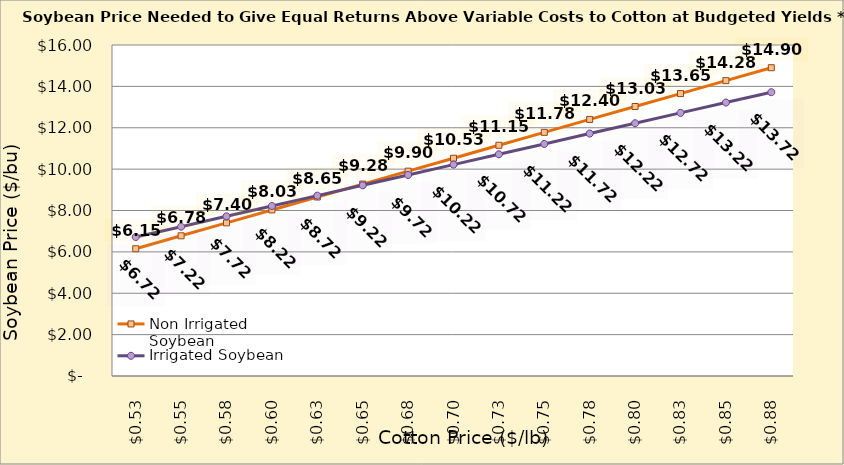
| Category | Non Irrigated Soybean | Irrigated Soybean |
|---|---|---|
| 0.5249999999999998 | 6.152 | 6.718 |
| 0.5499999999999998 | 6.777 | 7.218 |
| 0.5749999999999998 | 7.402 | 7.718 |
| 0.5999999999999999 | 8.027 | 8.218 |
| 0.6249999999999999 | 8.652 | 8.718 |
| 0.6499999999999999 | 9.277 | 9.218 |
| 0.6749999999999999 | 9.902 | 9.718 |
| 0.7 | 10.527 | 10.218 |
| 0.725 | 11.152 | 10.718 |
| 0.75 | 11.777 | 11.218 |
| 0.775 | 12.402 | 11.718 |
| 0.8 | 13.027 | 12.218 |
| 0.8250000000000001 | 13.652 | 12.718 |
| 0.8500000000000001 | 14.277 | 13.218 |
| 0.8750000000000001 | 14.902 | 13.718 |